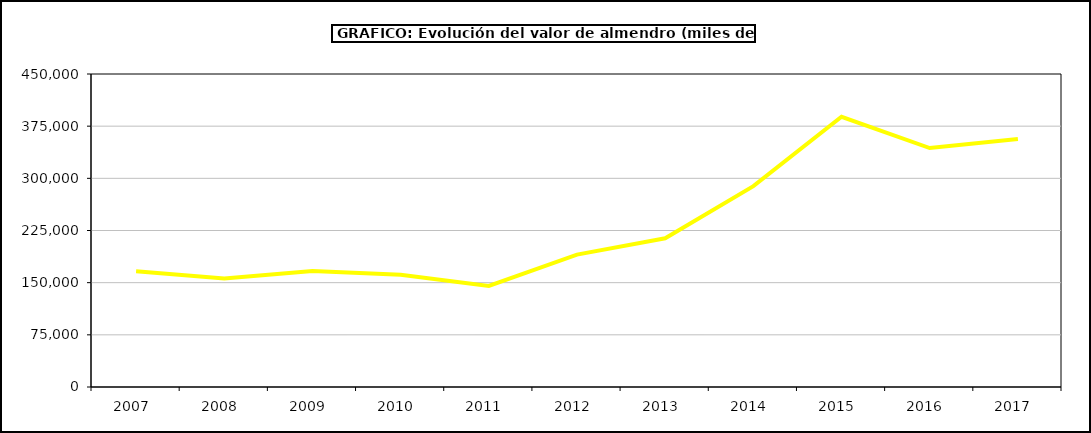
| Category | valor almendro |
|---|---|
| 2007.0 | 166525.934 |
| 2008.0 | 156005.219 |
| 2009.0 | 166823.782 |
| 2010.0 | 161485.094 |
| 2011.0 | 145270.034 |
| 2012.0 | 190305.336 |
| 2013.0 | 213791.63 |
| 2014.0 | 288832.154 |
| 2015.0 | 388475 |
| 2016.0 | 343509 |
| 2017.0 | 356619.875 |